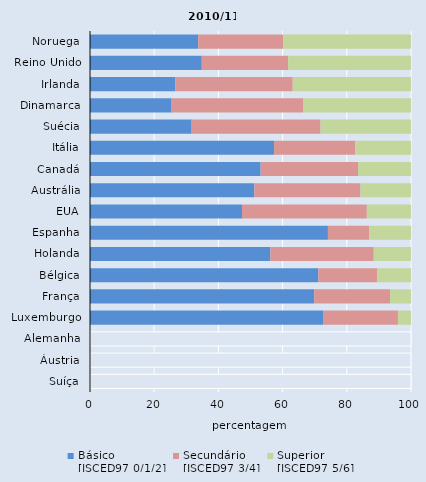
| Category | Básico
[ISCED97 0/1/2] | Secundário
[ISCED97 3/4] | Superior
[ISCED97 5/6] |
|---|---|---|---|
| Noruega | 33.712 | 26.447 | 39.841 |
| Reino Unido | 34.821 | 26.909 | 38.269 |
| Irlanda | 26.533 | 36.625 | 36.842 |
| Dinamarca | 25.419 | 40.944 | 33.638 |
| Suécia | 31.66 | 40.154 | 28.185 |
| Itália | 57.332 | 25.274 | 17.394 |
| Canadá | 53.155 | 30.334 | 16.511 |
| Austrália | 51.206 | 33.064 | 15.731 |
| EUA | 47.352 | 38.887 | 13.761 |
| Espanha | 74.124 | 12.877 | 12.998 |
| Holanda | 56.187 | 32.206 | 11.608 |
| Bélgica | 71.138 | 18.319 | 10.542 |
| França | 69.847 | 23.657 | 6.496 |
| Luxemburgo | 72.762 | 23.169 | 4.069 |
| Alemanha | 0 | 100 | 0 |
| Áustria | 0 | 100 | 0 |
| Suíça | 0 | 100 | 0 |